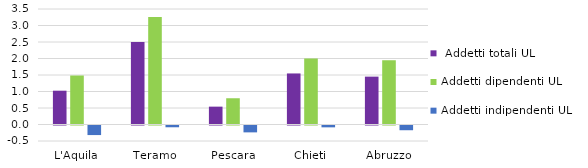
| Category |  Addetti totali UL | Addetti dipendenti UL | Addetti indipendenti UL |
|---|---|---|---|
| L'Aquila | 1.024 | 1.485 | -0.29 |
| Teramo | 2.496 | 3.257 | -0.054 |
| Pescara | 0.541 | 0.795 | -0.208 |
| Chieti | 1.547 | 2.001 | -0.056 |
| Abruzzo | 1.451 | 1.949 | -0.143 |